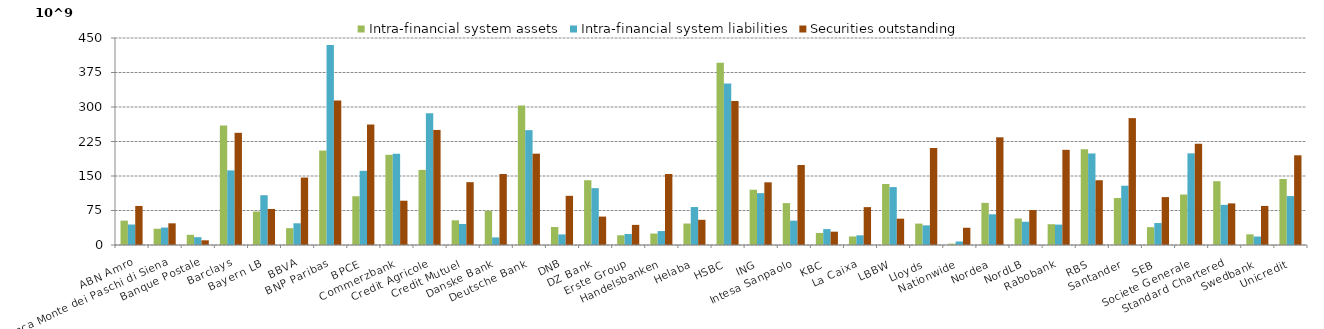
| Category | Intra-financial system assets | Intra-financial system liabilities | Securities outstanding |
|---|---|---|---|
| ABN Amro | 52974.052 | 44558.413 | 84892 |
| Banca Monte dei Paschi di Siena | 35384.271 | 37948.175 | 47116.872 |
| Banque Postale | 22171.211 | 17026.074 | 10171.342 |
| Barclays | 259692.132 | 162232.764 | 243855.468 |
| Bayern LB | 72793.349 | 108240.194 | 78342.673 |
| BBVA | 36559.899 | 47165.522 | 146605.253 |
| BNP Paribas | 205328.777 | 435011.483 | 313862.014 |
| BPCE | 106016 | 161284 | 261906 |
| Commerzbank | 196056 | 198439 | 96284 |
| Credit Agricole | 163301 | 286461.488 | 250135 |
| Credit Mutuel | 53684.816 | 45729.347 | 136575.712 |
| Danske Bank | 74132.967 | 16520.022 | 154333.388 |
| Deutsche Bank | 303108.213 | 249661.901 | 198552.248 |
| DNB | 39135.692 | 23018.288 | 106936.478 |
| DZ Bank | 140782.094 | 123554.428 | 61761.766 |
| Erste Group | 21076.854 | 23856.93 | 43739.285 |
| Handelsbanken | 24899.051 | 30298.212 | 154338.433 |
| Helaba | 46672.665 | 82525.326 | 54761.689 |
| HSBC | 396150.964 | 351346.202 | 313259.665 |
| ING | 120153 | 112744 | 136282 |
| Intesa Sanpaolo | 91100.217 | 52929.119 | 173891.97 |
| KBC | 26156.921 | 34568.216 | 28957 |
| La Caixa | 18550.967 | 21009.781 | 82359.206 |
| LBBW | 132618.012 | 125891.151 | 57214.709 |
| Lloyds | 46487.786 | 42660.66 | 210758.066 |
| Nationwide | 2948.303 | 7647.835 | 37491.904 |
| Nordea | 91594 | 66764 | 234109 |
| NordLB | 57653.452 | 50555.728 | 75994.701 |
| Rabobank | 45189 | 44298 | 206914 |
| RBS | 208002.879 | 199022.43 | 140782.056 |
| Santander | 102202.23 | 128858.697 | 275850.448 |
| SEB | 38748.402 | 47734.808 | 104141.746 |
| Societe Generale | 109774.202 | 199270.287 | 220094.466 |
| Standard Chartered | 138732.744 | 87292.001 | 90505.547 |
| Swedbank | 23202.732 | 18355.598 | 84953.317 |
| Unicredit | 143438.999 | 106319.153 | 195001.283 |